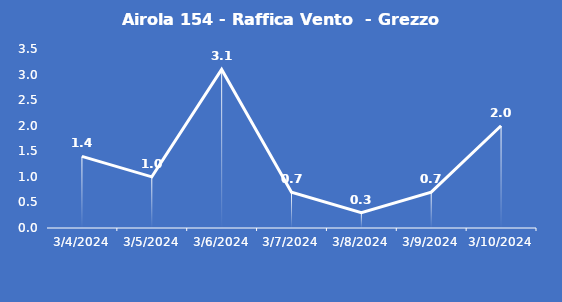
| Category | Airola 154 - Raffica Vento  - Grezzo (m/s) |
|---|---|
| 3/4/24 | 1.4 |
| 3/5/24 | 1 |
| 3/6/24 | 3.1 |
| 3/7/24 | 0.7 |
| 3/8/24 | 0.3 |
| 3/9/24 | 0.7 |
| 3/10/24 | 2 |